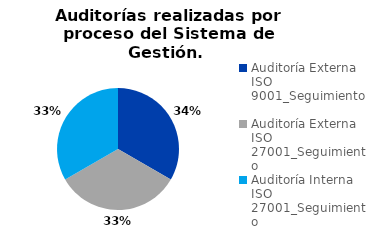
| Category | Total |
|---|---|
| Auditoría Externa ISO 9001_Seguimiento | 1 |
| Auditoría Externa ISO 27001_Seguimiento | 1 |
| Auditoría Interna ISO 27001_Seguimiento | 1 |